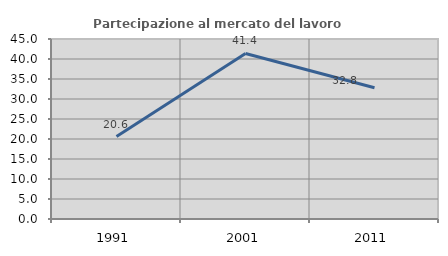
| Category | Partecipazione al mercato del lavoro  femminile |
|---|---|
| 1991.0 | 20.619 |
| 2001.0 | 41.392 |
| 2011.0 | 32.83 |